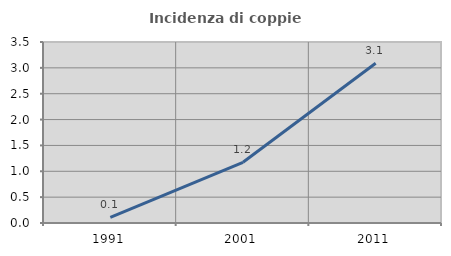
| Category | Incidenza di coppie miste |
|---|---|
| 1991.0 | 0.109 |
| 2001.0 | 1.174 |
| 2011.0 | 3.09 |